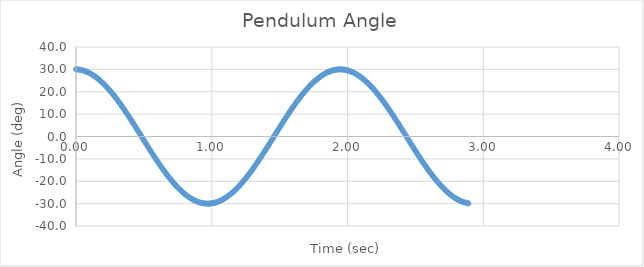
| Category | Series 0 |
|---|---|
| 0.0 | 30 |
| 0.01 | 29.969 |
| 0.02 | 29.908 |
| 0.03 | 29.816 |
| 0.04 | 29.693 |
| 0.05 | 29.54 |
| 0.060000000000000005 | 29.356 |
| 0.07 | 29.143 |
| 0.08 | 28.899 |
| 0.09 | 28.626 |
| 0.09999999999999999 | 28.323 |
| 0.10999999999999999 | 27.991 |
| 0.11999999999999998 | 27.63 |
| 0.12999999999999998 | 27.241 |
| 0.13999999999999999 | 26.823 |
| 0.15 | 26.378 |
| 0.16 | 25.906 |
| 0.17 | 25.406 |
| 0.18000000000000002 | 24.88 |
| 0.19000000000000003 | 24.329 |
| 0.20000000000000004 | 23.752 |
| 0.21000000000000005 | 23.15 |
| 0.22000000000000006 | 22.524 |
| 0.23000000000000007 | 21.874 |
| 0.24000000000000007 | 21.202 |
| 0.25000000000000006 | 20.507 |
| 0.26000000000000006 | 19.791 |
| 0.2700000000000001 | 19.054 |
| 0.2800000000000001 | 18.297 |
| 0.2900000000000001 | 17.521 |
| 0.3000000000000001 | 16.726 |
| 0.3100000000000001 | 15.913 |
| 0.3200000000000001 | 15.083 |
| 0.3300000000000001 | 14.238 |
| 0.34000000000000014 | 13.377 |
| 0.35000000000000014 | 12.502 |
| 0.36000000000000015 | 11.614 |
| 0.37000000000000016 | 10.714 |
| 0.38000000000000017 | 9.802 |
| 0.3900000000000002 | 8.879 |
| 0.4000000000000002 | 7.947 |
| 0.4100000000000002 | 7.007 |
| 0.4200000000000002 | 6.059 |
| 0.4300000000000002 | 5.105 |
| 0.4400000000000002 | 4.145 |
| 0.45000000000000023 | 3.18 |
| 0.46000000000000024 | 2.213 |
| 0.47000000000000025 | 1.242 |
| 0.48000000000000026 | 0.271 |
| 0.49000000000000027 | -0.701 |
| 0.5000000000000002 | -1.672 |
| 0.5100000000000002 | -2.641 |
| 0.5200000000000002 | -3.607 |
| 0.5300000000000002 | -4.57 |
| 0.5400000000000003 | -5.528 |
| 0.5500000000000003 | -6.479 |
| 0.5600000000000003 | -7.424 |
| 0.5700000000000003 | -8.361 |
| 0.5800000000000003 | -9.289 |
| 0.5900000000000003 | -10.207 |
| 0.6000000000000003 | -11.114 |
| 0.6100000000000003 | -12.009 |
| 0.6200000000000003 | -12.891 |
| 0.6300000000000003 | -13.76 |
| 0.6400000000000003 | -14.614 |
| 0.6500000000000004 | -15.452 |
| 0.6600000000000004 | -16.275 |
| 0.6700000000000004 | -17.079 |
| 0.6800000000000004 | -17.866 |
| 0.6900000000000004 | -18.634 |
| 0.7000000000000004 | -19.383 |
| 0.7100000000000004 | -20.111 |
| 0.7200000000000004 | -20.817 |
| 0.7300000000000004 | -21.502 |
| 0.7400000000000004 | -22.165 |
| 0.7500000000000004 | -22.804 |
| 0.7600000000000005 | -23.419 |
| 0.7700000000000005 | -24.01 |
| 0.7800000000000005 | -24.576 |
| 0.7900000000000005 | -25.116 |
| 0.8000000000000005 | -25.63 |
| 0.8100000000000005 | -26.118 |
| 0.8200000000000005 | -26.579 |
| 0.8300000000000005 | -27.012 |
| 0.8400000000000005 | -27.417 |
| 0.8500000000000005 | -27.793 |
| 0.8600000000000005 | -28.141 |
| 0.8700000000000006 | -28.461 |
| 0.8800000000000006 | -28.75 |
| 0.8900000000000006 | -29.01 |
| 0.9000000000000006 | -29.241 |
| 0.9100000000000006 | -29.441 |
| 0.9200000000000006 | -29.611 |
| 0.9300000000000006 | -29.751 |
| 0.9400000000000006 | -29.86 |
| 0.9500000000000006 | -29.939 |
| 0.9600000000000006 | -29.987 |
| 0.9700000000000006 | -30.004 |
| 0.9800000000000006 | -29.99 |
| 0.9900000000000007 | -29.946 |
| 1.0000000000000007 | -29.871 |
| 1.0100000000000007 | -29.765 |
| 1.0200000000000007 | -29.629 |
| 1.0300000000000007 | -29.462 |
| 1.0400000000000007 | -29.265 |
| 1.0500000000000007 | -29.039 |
| 1.0600000000000007 | -28.782 |
| 1.0700000000000007 | -28.495 |
| 1.0800000000000007 | -28.18 |
| 1.0900000000000007 | -27.835 |
| 1.1000000000000008 | -27.461 |
| 1.1100000000000008 | -27.06 |
| 1.1200000000000008 | -26.63 |
| 1.1300000000000008 | -26.172 |
| 1.1400000000000008 | -25.688 |
| 1.1500000000000008 | -25.177 |
| 1.1600000000000008 | -24.64 |
| 1.1700000000000008 | -24.077 |
| 1.1800000000000008 | -23.489 |
| 1.1900000000000008 | -22.876 |
| 1.2000000000000008 | -22.239 |
| 1.2100000000000009 | -21.58 |
| 1.2200000000000009 | -20.897 |
| 1.2300000000000009 | -20.193 |
| 1.2400000000000009 | -19.468 |
| 1.2500000000000009 | -18.722 |
| 1.260000000000001 | -17.956 |
| 1.270000000000001 | -17.171 |
| 1.280000000000001 | -16.368 |
| 1.290000000000001 | -15.548 |
| 1.300000000000001 | -14.711 |
| 1.310000000000001 | -13.859 |
| 1.320000000000001 | -12.992 |
| 1.330000000000001 | -12.111 |
| 1.340000000000001 | -11.217 |
| 1.350000000000001 | -10.312 |
| 1.360000000000001 | -9.395 |
| 1.370000000000001 | -8.468 |
| 1.380000000000001 | -7.532 |
| 1.390000000000001 | -6.589 |
| 1.400000000000001 | -5.638 |
| 1.410000000000001 | -4.681 |
| 1.420000000000001 | -3.719 |
| 1.430000000000001 | -2.753 |
| 1.440000000000001 | -1.784 |
| 1.450000000000001 | -0.813 |
| 1.460000000000001 | 0.159 |
| 1.470000000000001 | 1.13 |
| 1.480000000000001 | 2.101 |
| 1.490000000000001 | 3.069 |
| 1.500000000000001 | 4.034 |
| 1.5100000000000011 | 4.994 |
| 1.5200000000000011 | 5.949 |
| 1.5300000000000011 | 6.898 |
| 1.5400000000000011 | 7.839 |
| 1.5500000000000012 | 8.772 |
| 1.5600000000000012 | 9.696 |
| 1.5700000000000012 | 10.609 |
| 1.5800000000000012 | 11.511 |
| 1.5900000000000012 | 12.401 |
| 1.6000000000000012 | 13.277 |
| 1.6100000000000012 | 14.14 |
| 1.6200000000000012 | 14.987 |
| 1.6300000000000012 | 15.818 |
| 1.6400000000000012 | 16.633 |
| 1.6500000000000012 | 17.43 |
| 1.6600000000000013 | 18.208 |
| 1.6700000000000013 | 18.968 |
| 1.6800000000000013 | 19.707 |
| 1.6900000000000013 | 20.426 |
| 1.7000000000000013 | 21.123 |
| 1.7100000000000013 | 21.798 |
| 1.7200000000000013 | 22.45 |
| 1.7300000000000013 | 23.079 |
| 1.7400000000000013 | 23.684 |
| 1.7500000000000013 | 24.263 |
| 1.7600000000000013 | 24.818 |
| 1.7700000000000014 | 25.347 |
| 1.7800000000000014 | 25.849 |
| 1.7900000000000014 | 26.325 |
| 1.8000000000000014 | 26.773 |
| 1.8100000000000014 | 27.194 |
| 1.8200000000000014 | 27.587 |
| 1.8300000000000014 | 27.951 |
| 1.8400000000000014 | 28.286 |
| 1.8500000000000014 | 28.592 |
| 1.8600000000000014 | 28.869 |
| 1.8700000000000014 | 29.116 |
| 1.8800000000000014 | 29.333 |
| 1.8900000000000015 | 29.52 |
| 1.9000000000000015 | 29.677 |
| 1.9100000000000015 | 29.803 |
| 1.9200000000000015 | 29.899 |
| 1.9300000000000015 | 29.964 |
| 1.9400000000000015 | 29.998 |
| 1.9500000000000015 | 30.002 |
| 1.9600000000000015 | 29.974 |
| 1.9700000000000015 | 29.916 |
| 1.9800000000000015 | 29.828 |
| 1.9900000000000015 | 29.709 |
| 2.0000000000000013 | 29.559 |
| 2.010000000000001 | 29.379 |
| 2.020000000000001 | 29.169 |
| 2.0300000000000007 | 28.929 |
| 2.0400000000000005 | 28.659 |
| 2.0500000000000003 | 28.359 |
| 2.06 | 28.031 |
| 2.07 | 27.673 |
| 2.0799999999999996 | 27.287 |
| 2.0899999999999994 | 26.873 |
| 2.099999999999999 | 26.431 |
| 2.109999999999999 | 25.961 |
| 2.1199999999999988 | 25.465 |
| 2.1299999999999986 | 24.942 |
| 2.1399999999999983 | 24.394 |
| 2.149999999999998 | 23.819 |
| 2.159999999999998 | 23.221 |
| 2.1699999999999977 | 22.597 |
| 2.1799999999999975 | 21.95 |
| 2.1899999999999973 | 21.281 |
| 2.199999999999997 | 20.589 |
| 2.209999999999997 | 19.875 |
| 2.2199999999999966 | 19.14 |
| 2.2299999999999964 | 18.385 |
| 2.239999999999996 | 17.611 |
| 2.249999999999996 | 16.818 |
| 2.259999999999996 | 16.008 |
| 2.2699999999999956 | 15.18 |
| 2.2799999999999954 | 14.336 |
| 2.289999999999995 | 13.477 |
| 2.299999999999995 | 12.604 |
| 2.3099999999999947 | 11.717 |
| 2.3199999999999945 | 10.818 |
| 2.3299999999999943 | 9.907 |
| 2.339999999999994 | 8.986 |
| 2.349999999999994 | 8.055 |
| 2.3599999999999937 | 7.116 |
| 2.3699999999999934 | 6.169 |
| 2.3799999999999932 | 5.215 |
| 2.389999999999993 | 4.256 |
| 2.399999999999993 | 3.292 |
| 2.4099999999999926 | 2.324 |
| 2.4199999999999924 | 1.354 |
| 2.429999999999992 | 0.383 |
| 2.439999999999992 | -0.589 |
| 2.4499999999999917 | -1.56 |
| 2.4599999999999915 | -2.529 |
| 2.4699999999999913 | -3.496 |
| 2.479999999999991 | -4.459 |
| 2.489999999999991 | -5.417 |
| 2.4999999999999907 | -6.37 |
| 2.5099999999999905 | -7.315 |
| 2.5199999999999902 | -8.253 |
| 2.52999999999999 | -9.182 |
| 2.53999999999999 | -10.101 |
| 2.5499999999999896 | -11.01 |
| 2.5599999999999894 | -11.906 |
| 2.569999999999989 | -12.79 |
| 2.579999999999989 | -13.66 |
| 2.5899999999999888 | -14.516 |
| 2.5999999999999885 | -15.357 |
| 2.6099999999999883 | -16.181 |
| 2.619999999999988 | -16.988 |
| 2.629999999999988 | -17.777 |
| 2.6399999999999877 | -18.547 |
| 2.6499999999999875 | -19.297 |
| 2.6599999999999873 | -20.028 |
| 2.669999999999987 | -20.737 |
| 2.679999999999987 | -21.424 |
| 2.6899999999999866 | -22.089 |
| 2.6999999999999864 | -22.731 |
| 2.709999999999986 | -23.349 |
| 2.719999999999986 | -23.943 |
| 2.7299999999999858 | -24.512 |
| 2.7399999999999856 | -25.055 |
| 2.7499999999999853 | -25.572 |
| 2.759999999999985 | -26.063 |
| 2.769999999999985 | -26.527 |
| 2.7799999999999847 | -26.963 |
| 2.7899999999999845 | -27.371 |
| 2.7999999999999843 | -27.751 |
| 2.809999999999984 | -28.103 |
| 2.819999999999984 | -28.425 |
| 2.8299999999999836 | -28.718 |
| 2.8399999999999834 | -28.982 |
| 2.849999999999983 | -29.216 |
| 2.859999999999983 | -29.42 |
| 2.869999999999983 | -29.593 |
| 2.8799999999999826 | -29.736 |
| 2.8899999999999824 | -29.849 |